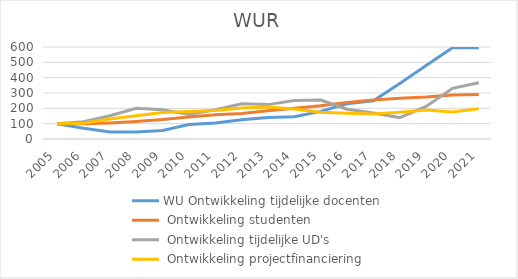
| Category | WU |
|---|---|
| 2005.0 | 100 |
| 2006.0 | 102.688 |
| 2007.0 | 129.86 |
| 2008.0 | 151.059 |
| 2009.0 | 172.058 |
| 2010.0 | 179.666 |
| 2011.0 | 185.287 |
| 2012.0 | 201.469 |
| 2013.0 | 208.253 |
| 2014.0 | 195.052 |
| 2015.0 | 173.793 |
| 2016.0 | 167.771 |
| 2017.0 | 162.308 |
| 2018.0 | 174.415 |
| 2019.0 | 188.291 |
| 2020.0 | 175.355 |
| 2021.0 | 197.413 |